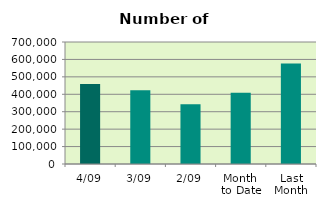
| Category | Series 0 |
|---|---|
| 4/09 | 458752 |
| 3/09 | 422684 |
| 2/09 | 343334 |
| Month 
to Date | 408256.667 |
| Last
Month | 576518.909 |